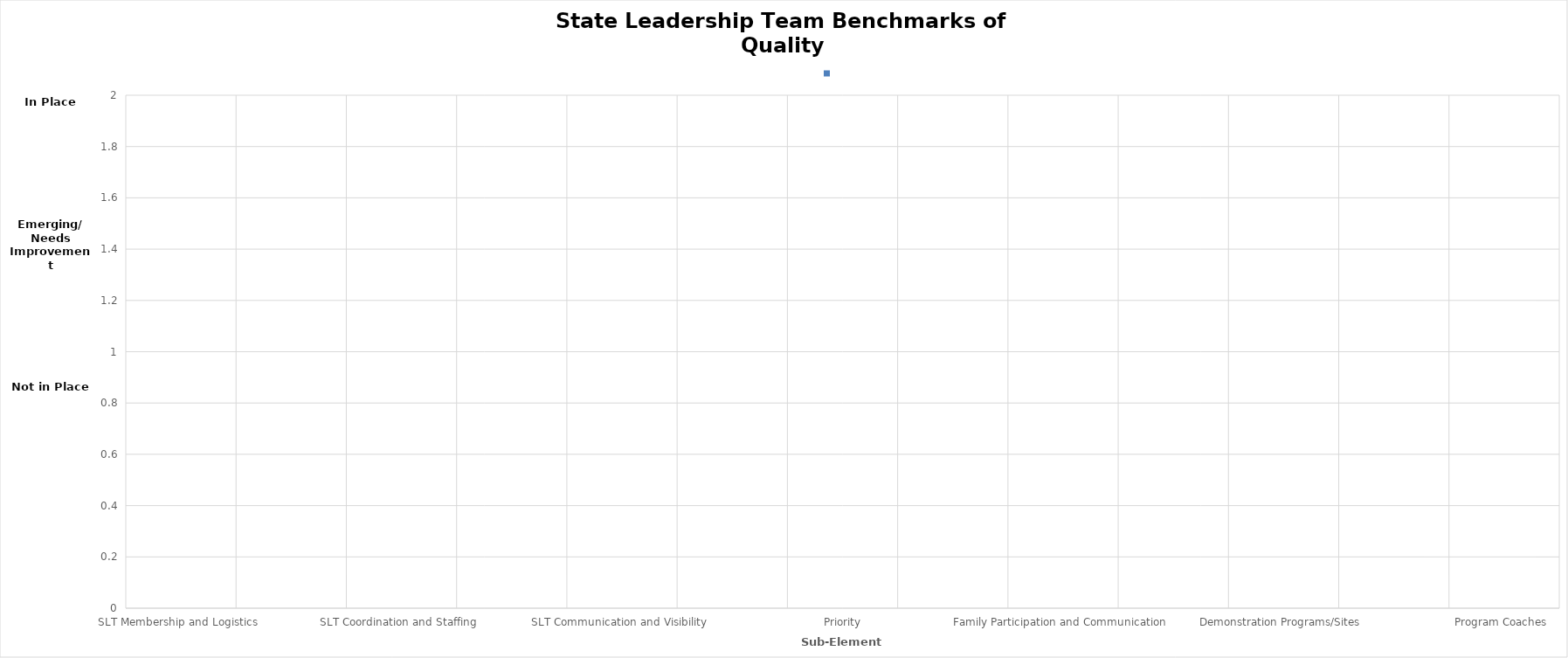
| Category | Series 0 |
|---|---|
| SLT Membership and Logistics  | 0 |
| Action Planning  | 0 |
| SLT Coordination and Staffing  | 0 |
| SLT Funding  | 0 |
| SLT Communication and Visibility  | 0 |
| Authority, Priority, and Communication Linkages  | 0 |
| Family Participation and Communication  | 0 |
| Implementation Programs/Sites  | 0 |
| Demonstration Programs/Sites  | 0 |
| Implementation Communities  | 0 |
| Program Coaches  | 0 |
| Ongoing Support and Technical Assistance  | 0 |
| Data-Based Decision Making  | 0 |